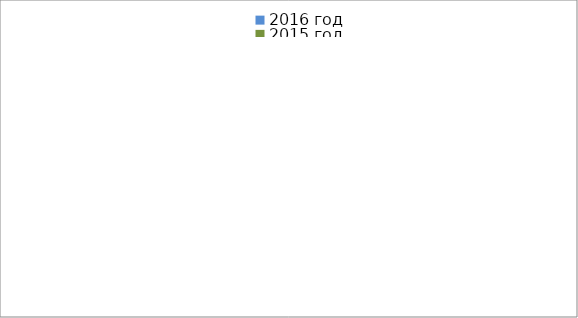
| Category | 2016 год | 2015 год |
|---|---|---|
|  - поджог | 2 | 11 |
|  - неосторожное обращение с огнём | 0 | 5 |
|  - НПТЭ электрооборудования | 1 | 2 |
|  - НПУ и Э печей | 5 | 9 |
|  - НПУ и Э транспортных средств | 14 | 4 |
|   -Шалость с огнем детей | 0 | 1 |
|  -НППБ при эксплуатации эл.приборов | 9 | 1 |
|  - курение | 3 | 0 |
| - прочие | 15 | 11 |
| - не установленные причины | 0 | 5 |